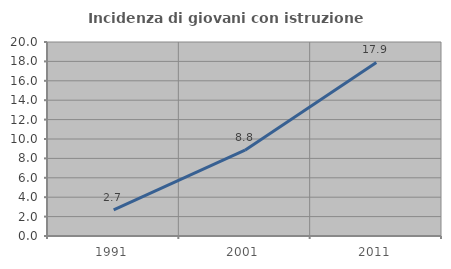
| Category | Incidenza di giovani con istruzione universitaria |
|---|---|
| 1991.0 | 2.703 |
| 2001.0 | 8.844 |
| 2011.0 | 17.895 |